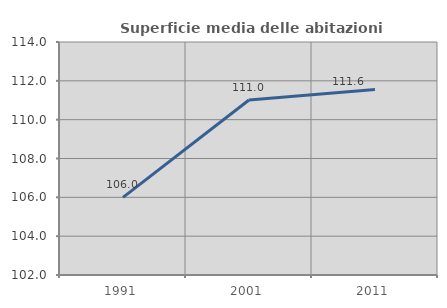
| Category | Superficie media delle abitazioni occupate |
|---|---|
| 1991.0 | 105.995 |
| 2001.0 | 111.011 |
| 2011.0 | 111.554 |